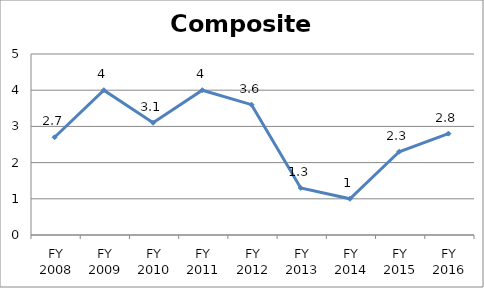
| Category | Composite score |
|---|---|
| FY 2016 | 2.8 |
| FY 2015 | 2.3 |
| FY 2014 | 1 |
| FY 2013 | 1.3 |
| FY 2012 | 3.6 |
| FY 2011 | 4 |
| FY 2010 | 3.1 |
| FY 2009 | 4 |
| FY 2008 | 2.7 |